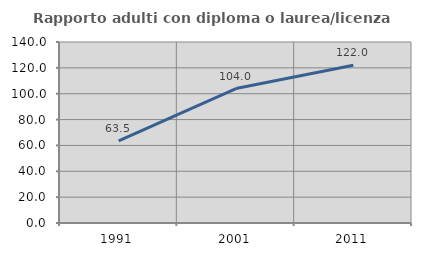
| Category | Rapporto adulti con diploma o laurea/licenza media  |
|---|---|
| 1991.0 | 63.514 |
| 2001.0 | 103.974 |
| 2011.0 | 122.034 |